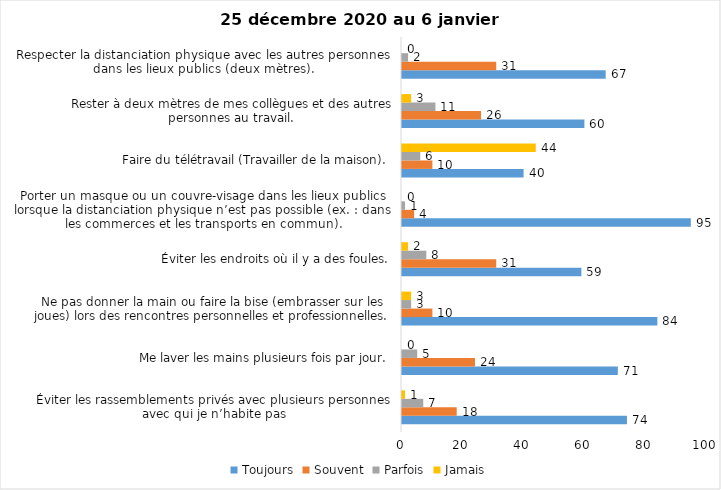
| Category | Toujours | Souvent | Parfois | Jamais |
|---|---|---|---|---|
| Éviter les rassemblements privés avec plusieurs personnes avec qui je n’habite pas | 74 | 18 | 7 | 1 |
| Me laver les mains plusieurs fois par jour. | 71 | 24 | 5 | 0 |
| Ne pas donner la main ou faire la bise (embrasser sur les joues) lors des rencontres personnelles et professionnelles. | 84 | 10 | 3 | 3 |
| Éviter les endroits où il y a des foules. | 59 | 31 | 8 | 2 |
| Porter un masque ou un couvre-visage dans les lieux publics lorsque la distanciation physique n’est pas possible (ex. : dans les commerces et les transports en commun). | 95 | 4 | 1 | 0 |
| Faire du télétravail (Travailler de la maison). | 40 | 10 | 6 | 44 |
| Rester à deux mètres de mes collègues et des autres personnes au travail. | 60 | 26 | 11 | 3 |
| Respecter la distanciation physique avec les autres personnes dans les lieux publics (deux mètres). | 67 | 31 | 2 | 0 |